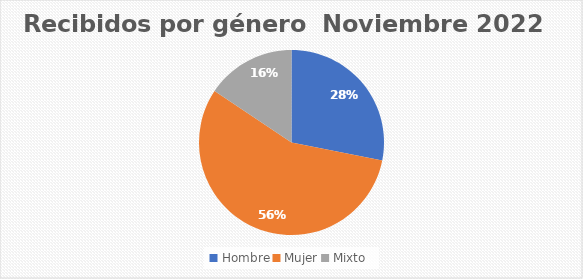
| Category | Recibidos por género  Noviembre |
|---|---|
| Hombre | 9 |
| Mujer | 18 |
| Mixto | 5 |